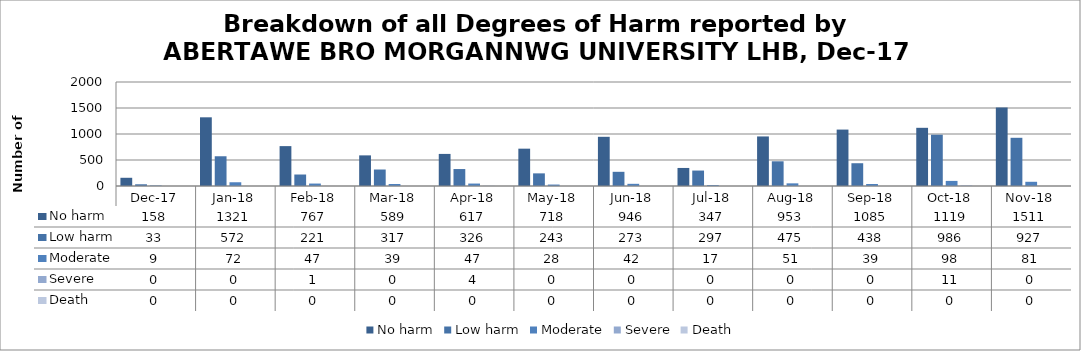
| Category | No harm | Low harm | Moderate | Severe | Death |
|---|---|---|---|---|---|
| Dec-17 | 158 | 33 | 9 | 0 | 0 |
| Jan-18 | 1321 | 572 | 72 | 0 | 0 |
| Feb-18 | 767 | 221 | 47 | 1 | 0 |
| Mar-18 | 589 | 317 | 39 | 0 | 0 |
| Apr-18 | 617 | 326 | 47 | 4 | 0 |
| May-18 | 718 | 243 | 28 | 0 | 0 |
| Jun-18 | 946 | 273 | 42 | 0 | 0 |
| Jul-18 | 347 | 297 | 17 | 0 | 0 |
| Aug-18 | 953 | 475 | 51 | 0 | 0 |
| Sep-18 | 1085 | 438 | 39 | 0 | 0 |
| Oct-18 | 1119 | 986 | 98 | 11 | 0 |
| Nov-18 | 1511 | 927 | 81 | 0 | 0 |